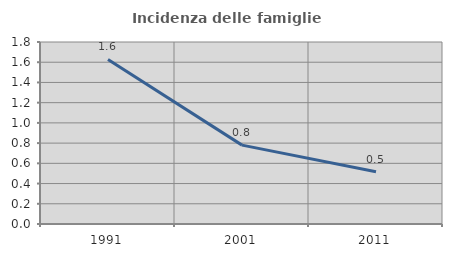
| Category | Incidenza delle famiglie numerose |
|---|---|
| 1991.0 | 1.628 |
| 2001.0 | 0.78 |
| 2011.0 | 0.517 |